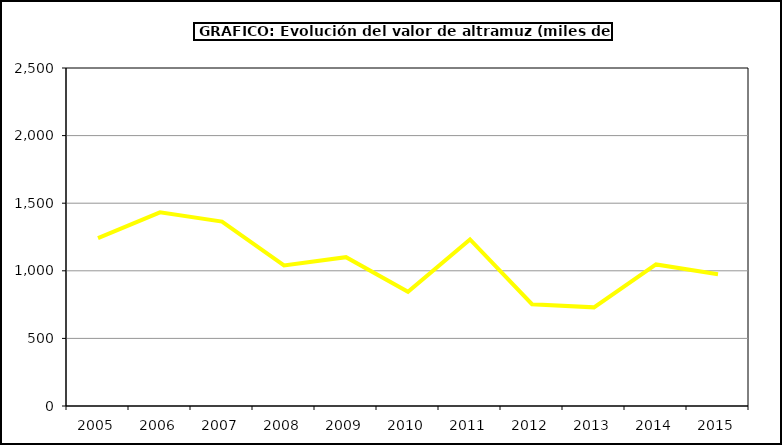
| Category | Valor |
|---|---|
| 2005.0 | 1241.17 |
| 2006.0 | 1432.07 |
| 2007.0 | 1363.907 |
| 2008.0 | 1039.238 |
| 2009.0 | 1100.989 |
| 2010.0 | 845.15 |
| 2011.0 | 1232.091 |
| 2012.0 | 752.557 |
| 2013.0 | 729.577 |
| 2014.0 | 1047.124 |
| 2015.0 | 975 |